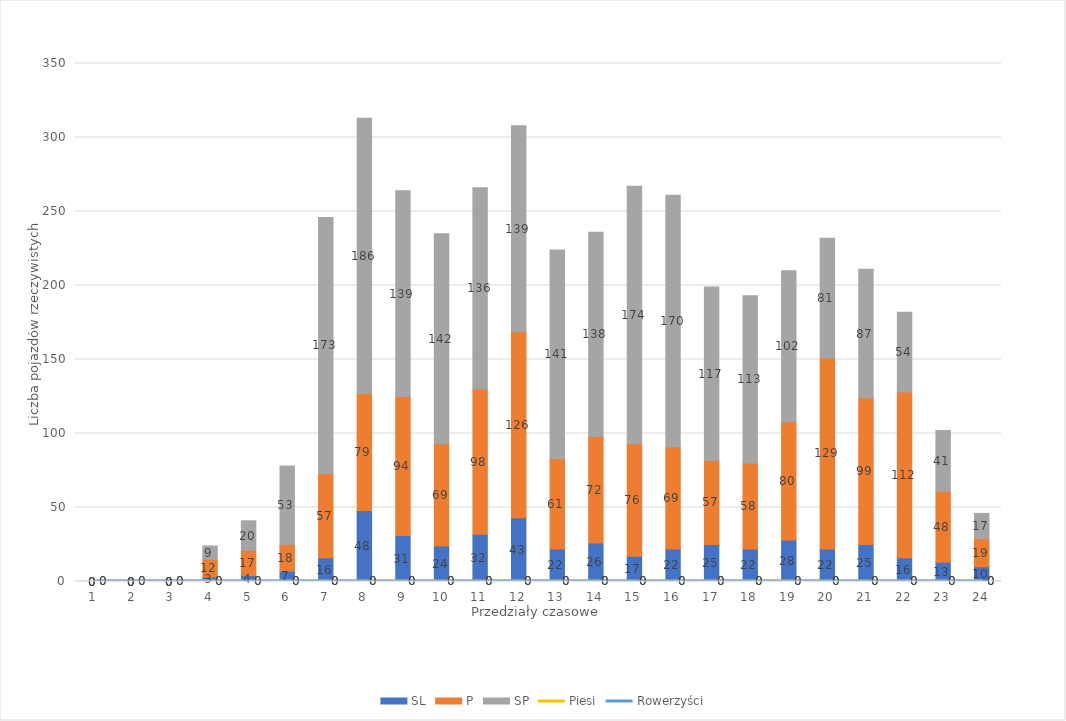
| Category | SL | P | SP |
|---|---|---|---|
| 0 | 0 | 0 | 0 |
| 1 | 0 | 0 | 0 |
| 2 | 0 | 0 | 0 |
| 3 | 3 | 12 | 9 |
| 4 | 4 | 17 | 20 |
| 5 | 7 | 18 | 53 |
| 6 | 16 | 57 | 173 |
| 7 | 48 | 79 | 186 |
| 8 | 31 | 94 | 139 |
| 9 | 24 | 69 | 142 |
| 10 | 32 | 98 | 136 |
| 11 | 43 | 126 | 139 |
| 12 | 22 | 61 | 141 |
| 13 | 26 | 72 | 138 |
| 14 | 17 | 76 | 174 |
| 15 | 22 | 69 | 170 |
| 16 | 25 | 57 | 117 |
| 17 | 22 | 58 | 113 |
| 18 | 28 | 80 | 102 |
| 19 | 22 | 129 | 81 |
| 20 | 25 | 99 | 87 |
| 21 | 16 | 112 | 54 |
| 22 | 13 | 48 | 41 |
| 23 | 10 | 19 | 17 |